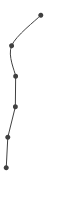
| Category | Series 0 |
|---|---|
| 0.5697166122225313 | 1 |
| 0.09013395638548291 | 2 |
| 0.15689240711529784 | 3 |
| 0.1521465430666971 | 4 |
| 0.028075731591025502 | 5 |
| 0.002445370888697613 | 6 |